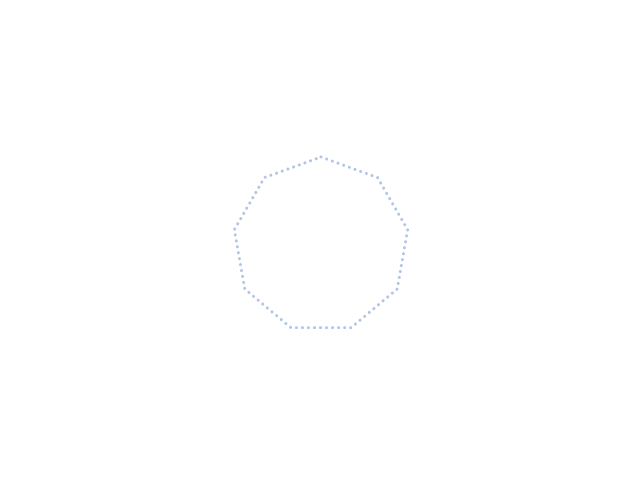
| Category | PREMIÈRE ANNÉE | DEUXIÈME ANNÉE | Niveau attendu première année |
|---|---|---|---|
| Compétences/connaissances | 0 | 0 | 2 |
| Ressources internes/externes | 0 | 0 | 2 |
| Organiser planifier | 0 | 0 | 2 |
| Suivre avancées/progrès | 0 | 0 | 2 |
| Environnement, collectif de travail | 0 | 0 | 2 |
| Responsabilités, initiatives | 0 | 0 | 2 |
| S'adapter, remédier aux difficultés | 0 | 0 | 2 |
| Rendre compte de l'avancement | 0 | 0 | 2 |
| Analyser/évaluer son travail personnel | 0 | 0 | 2 |